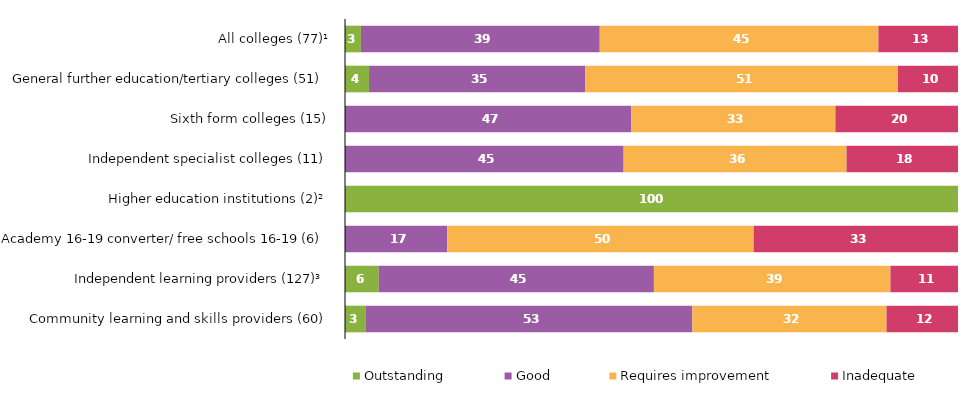
| Category | Outstanding | Good | Requires improvement | Inadequate |
|---|---|---|---|---|
| All colleges (77)¹ | 2.597 | 38.961 | 45.455 | 12.987 |
| General further education/tertiary colleges (51) | 3.922 | 35.294 | 50.98 | 9.804 |
| Sixth form colleges (15) | 0 | 46.667 | 33.333 | 20 |
| Independent specialist colleges (11) | 0 | 45.455 | 36.364 | 18.182 |
| Higher education institutions (2)² | 100 | 0 | 0 | 0 |
| Academy 16-19 converter/ free schools 16-19 (6) | 0 | 16.667 | 50 | 33.333 |
| Independent learning providers (127)³ | 5.512 | 44.882 | 38.583 | 11.024 |
| Community learning and skills providers (60) | 3.333 | 53.333 | 31.667 | 11.667 |